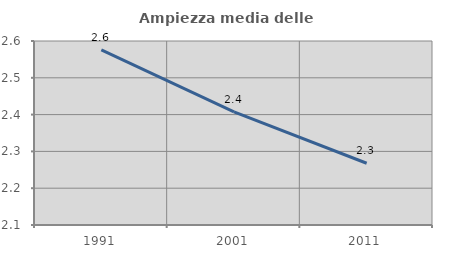
| Category | Ampiezza media delle famiglie |
|---|---|
| 1991.0 | 2.576 |
| 2001.0 | 2.408 |
| 2011.0 | 2.268 |